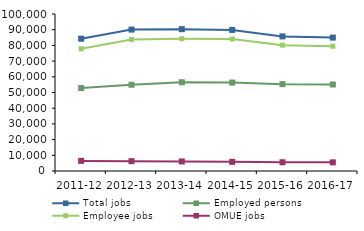
| Category | Total jobs | Employed persons | Employee jobs | OMUE jobs |
|---|---|---|---|---|
| 2011-12 | 84265 | 52819 | 77818 | 6447 |
| 2012-13 | 90066 | 54947 | 83785 | 6279 |
| 2013-14 | 90339 | 56546 | 84256 | 6085 |
| 2014-15 | 89870 | 56318 | 84045 | 5828 |
| 2015-16 | 85735 | 55328 | 80166 | 5568 |
| 2016-17 | 84967 | 55091 | 79465 | 5502 |